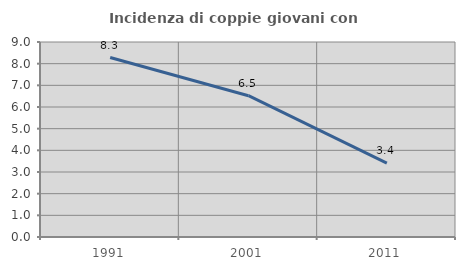
| Category | Incidenza di coppie giovani con figli |
|---|---|
| 1991.0 | 8.284 |
| 2001.0 | 6.522 |
| 2011.0 | 3.409 |